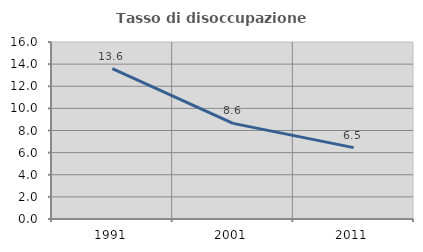
| Category | Tasso di disoccupazione giovanile  |
|---|---|
| 1991.0 | 13.592 |
| 2001.0 | 8.642 |
| 2011.0 | 6.452 |